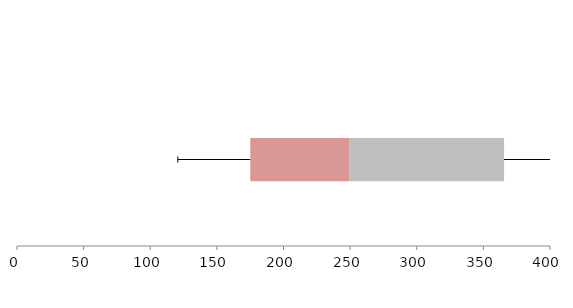
| Category | Series 1 | Series 2 | Series 3 |
|---|---|---|---|
| 0 | 175.07 | 74.583 | 115.882 |